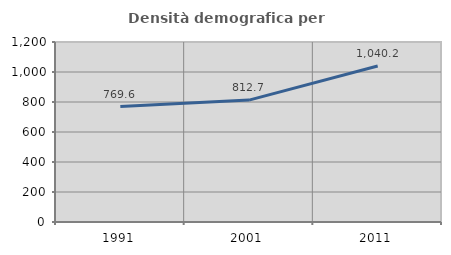
| Category | Densità demografica |
|---|---|
| 1991.0 | 769.572 |
| 2001.0 | 812.691 |
| 2011.0 | 1040.173 |